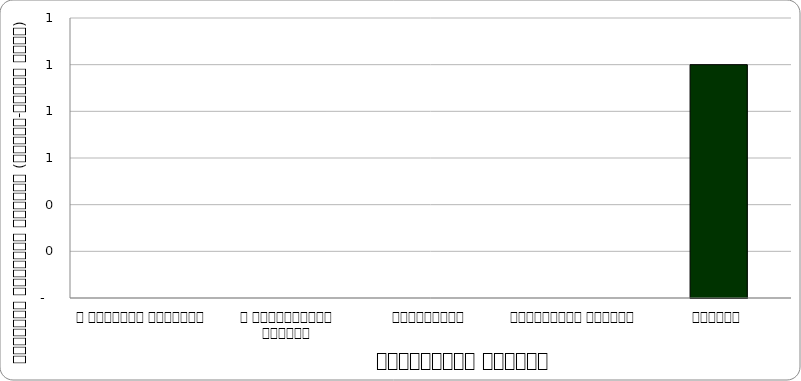
| Category | प्राकृतिक प्रकोप |
|---|---|
| द हिमालयन टाइम्स् | 0 |
| द काठमाण्डौं पोस्ट् | 0 |
| कान्तिपुर | 0 |
| अन्नपूर्ण पोस्ट् | 0 |
| नागरिक | 1 |